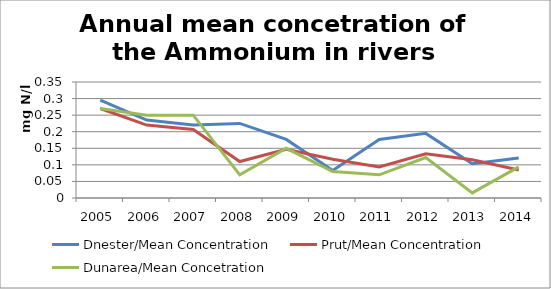
| Category | Dnester/Mean Concentration  | Prut/Mean Concentration | Dunarea/Mean Concetration |
|---|---|---|---|
| 2005.0 | 0.295 | 0.27 | 0.27 |
| 2006.0 | 0.235 | 0.22 | 0.25 |
| 2007.0 | 0.22 | 0.207 | 0.25 |
| 2008.0 | 0.225 | 0.11 | 0.07 |
| 2009.0 | 0.177 | 0.147 | 0.15 |
| 2010.0 | 0.083 | 0.117 | 0.08 |
| 2011.0 | 0.177 | 0.093 | 0.07 |
| 2012.0 | 0.195 | 0.133 | 0.122 |
| 2013.0 | 0.103 | 0.116 | 0.016 |
| 2014.0 | 0.121 | 0.085 | 0.094 |